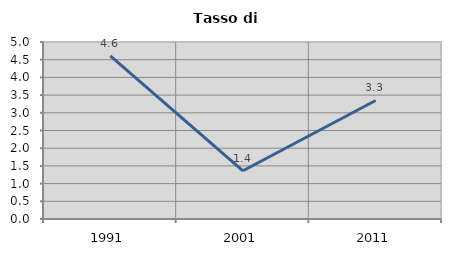
| Category | Tasso di disoccupazione   |
|---|---|
| 1991.0 | 4.605 |
| 2001.0 | 1.362 |
| 2011.0 | 3.348 |